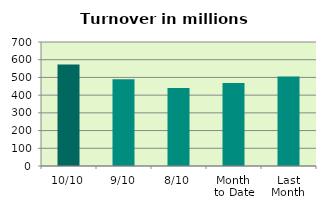
| Category | Series 0 |
|---|---|
| 10/10 | 573.161 |
| 9/10 | 489.227 |
| 8/10 | 439.732 |
| Month 
to Date | 468.547 |
| Last
Month | 505.274 |